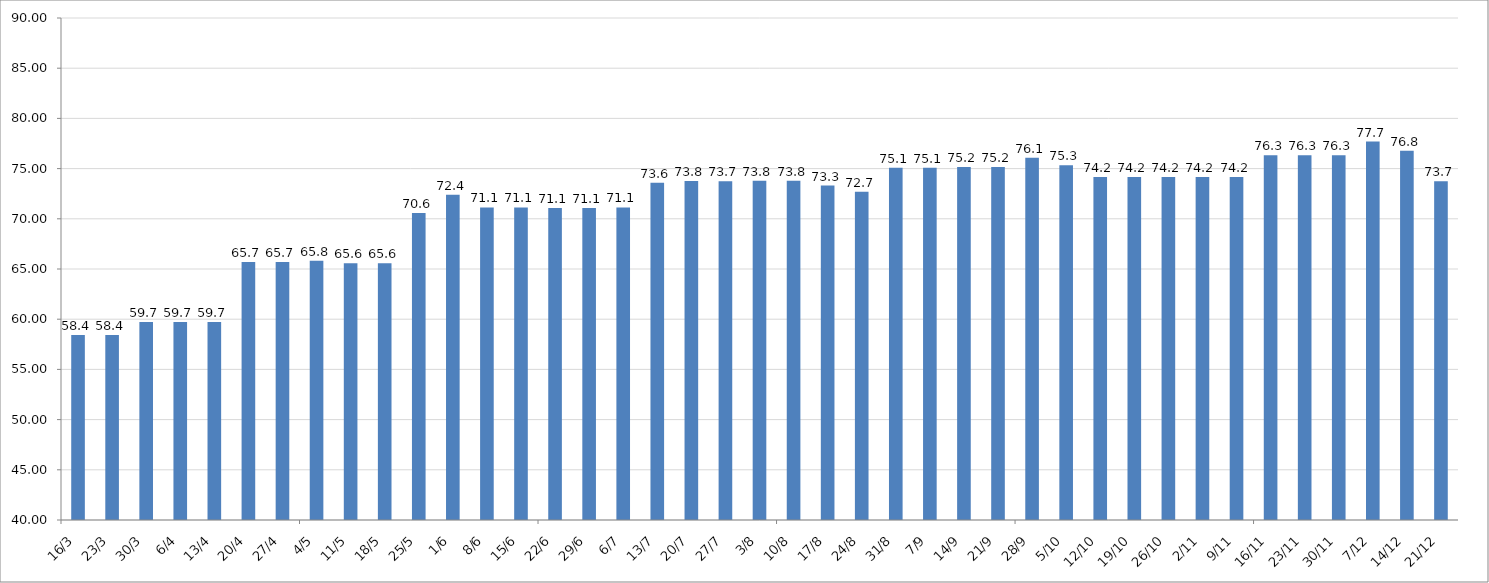
| Category | Series 0 |
|---|---|
| 2020-03-16 | 58.414 |
| 2020-03-23 | 58.414 |
| 2020-03-30 | 59.717 |
| 2020-04-06 | 59.717 |
| 2020-04-13 | 59.717 |
| 2020-04-20 | 65.7 |
| 2020-04-27 | 65.7 |
| 2020-05-04 | 65.817 |
| 2020-05-11 | 65.567 |
| 2020-05-18 | 65.567 |
| 2020-05-25 | 70.567 |
| 2020-06-01 | 72.4 |
| 2020-06-08 | 71.133 |
| 2020-06-15 | 71.133 |
| 2020-06-22 | 71.083 |
| 2020-06-29 | 71.083 |
| 2020-07-06 | 71.137 |
| 2020-07-13 | 73.602 |
| 2020-07-20 | 73.758 |
| 2020-07-27 | 73.733 |
| 2020-08-03 | 73.783 |
| 2020-08-10 | 73.783 |
| 2020-08-17 | 73.317 |
| 2020-08-24 | 72.7 |
| 2020-08-31 | 75.075 |
| 2020-09-07 | 75.075 |
| 2020-09-14 | 75.158 |
| 2020-09-21 | 75.158 |
| 2020-09-28 | 76.075 |
| 2020-10-05 | 75.325 |
| 2020-10-12 | 74.158 |
| 2020-10-19 | 74.158 |
| 2020-10-26 | 74.158 |
| 2020-11-02 | 74.158 |
| 2020-11-09 | 74.158 |
| 2020-11-16 | 76.325 |
| 2020-11-23 | 76.325 |
| 2020-11-30 | 76.325 |
| 2020-12-07 | 77.69 |
| 2020-12-14 | 76.78 |
| 2020-12-21 | 73.733 |